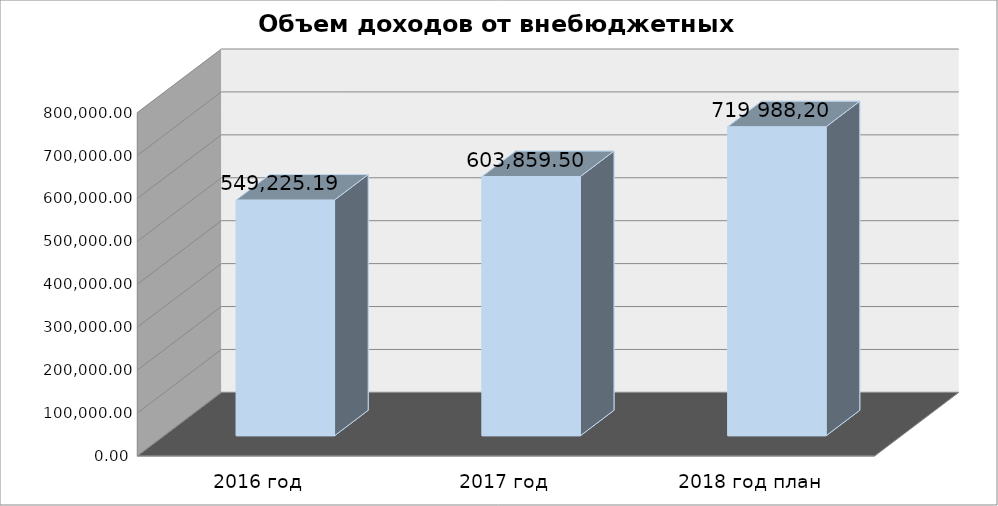
| Category | Series 0 |
|---|---|
| 2016 год | 549225.19 |
| 2017 год | 603859.5 |
| 2018 год план | 719988.2 |